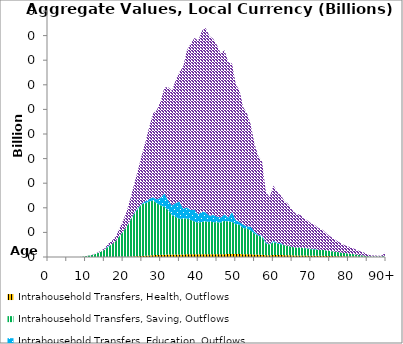
| Category | Intrahousehold Transfers, Health, Outflows | Intrahousehold Transfers, Saving, Outflows | Intrahousehold Transfers, Education, Outflows | Intrahousehold Transfers, Consumption other than health and education, Outflows |
|---|---|---|---|---|
| 0 | 0 | 0 | 0 | 0 |
|  | 0 | 0 | 0 | 0 |
| 2 | 0 | 0 | 0 | 0 |
| 3 | 0 | 0 | 0 | 0 |
| 4 | 0 | 0 | 0 | 0 |
| 5 | 0 | 0 | 0 | 0 |
| 6 | 0 | 0 | 0 | 0 |
| 7 | 0 | 0.003 | 0 | 0 |
| 8 | 0 | 0.023 | 0 | 0.002 |
| 9 | 0 | 0.139 | 0 | 0.013 |
| 10 | 0.001 | 0.575 | 0 | 0.046 |
| 11 | 0.002 | 1.24 | 0 | 0.125 |
| 12 | 0.005 | 1.8 | 0 | 0.222 |
| 13 | 0.011 | 2.937 | 0 | 0.452 |
| 14 | 0.018 | 4.168 | 0 | 0.77 |
| 15 | 0.026 | 5.753 | 0 | 1.125 |
| 16 | 0.041 | 8.189 | 0.634 | 1.755 |
| 17 | 0.058 | 10.365 | 0 | 2.621 |
| 18 | 0.08 | 12.707 | 0 | 3.69 |
| 19 | 0.12 | 16.817 | 0.11 | 6.054 |
| 20 | 0.166 | 20.52 | 0.163 | 8.84 |
| 21 | 0.236 | 24.615 | 0.067 | 12.438 |
| 22 | 0.349 | 29.89 | 0.311 | 17.809 |
| 23 | 0.487 | 34.715 | 0.671 | 24.065 |
| 24 | 0.643 | 38.749 | 0.839 | 30.945 |
| 25 | 0.853 | 42.023 | 0.51 | 39.974 |
| 26 | 1.056 | 42.728 | 1.695 | 48.631 |
| 27 | 1.29 | 43.96 | 2.113 | 58.899 |
| 28 | 1.502 | 44.371 | 2.784 | 68.13 |
| 29 | 1.609 | 42.073 | 3.172 | 72.73 |
| 30 | 1.733 | 40.245 | 6.374 | 78.414 |
| 31 | 1.894 | 38.817 | 11.05 | 86.074 |
| 32 | 1.985 | 36.187 | 7.8 | 92.05 |
| 33 | 1.935 | 32.077 | 7.948 | 93.178 |
| 34 | 1.988 | 30.54 | 11.405 | 99.812 |
| 35 | 1.992 | 29.142 | 13.99 | 105.293 |
| 36 | 2.077 | 29.148 | 8.02 | 115.632 |
| 37 | 2.183 | 29.064 | 9.217 | 127.625 |
| 38 | 2.201 | 27.939 | 8.006 | 135.308 |
| 39 | 2.176 | 26.657 | 9.838 | 139.489 |
| 40 | 2.155 | 25.789 | 6.577 | 141.378 |
| 41 | 2.22 | 26.317 | 8.51 | 146.974 |
| 42 | 2.267 | 26.712 | 7.282 | 149.929 |
| 43 | 2.23 | 26.24 | 5.135 | 146.01 |
| 44 | 2.208 | 26.142 | 5.855 | 143.122 |
| 45 | 2.193 | 26.034 | 4.684 | 139.241 |
| 46 | 2.187 | 25.822 | 4.142 | 133.239 |
| 47 | 2.324 | 27.013 | 5.369 | 133.547 |
| 48 | 2.363 | 26.492 | 3.231 | 126.243 |
| 49 | 2.414 | 26.083 | 8.127 | 120.709 |
| 50 | 2.339 | 24.36 | 3.2 | 110.449 |
| 51 | 2.397 | 23.745 | 2.377 | 106.781 |
| 52 | 2.279 | 21.195 | 2.867 | 95.348 |
| 53 | 2.329 | 20.915 | 1.623 | 91.831 |
| 54 | 2.229 | 19.25 | 3.278 | 82.74 |
| 55 | 2.026 | 16.923 | 1.518 | 71.177 |
| 56 | 1.933 | 15.441 | 0.667 | 63.962 |
| 57 | 1.909 | 14.398 | 1.04 | 60.198 |
| 58 | 1.365 | 9.729 | 1.023 | 40.921 |
| 59 | 1.342 | 8.895 | 0.125 | 38.194 |
| 60 | 1.663 | 10.362 | 1.042 | 45.004 |
| 61 | 1.615 | 9.503 | 0.389 | 41.653 |
| 62 | 1.568 | 8.803 | 0.876 | 38.879 |
| 63 | 1.495 | 8.018 | 0.026 | 35.767 |
| 64 | 1.456 | 7.629 | 0.04 | 33.873 |
| 65 | 1.328 | 6.847 | 0.047 | 30.105 |
| 66 | 1.246 | 6.401 | 0.01 | 27.427 |
| 67 | 1.259 | 6.446 | 0.169 | 26.853 |
| 68 | 1.185 | 6.05 | 0.005 | 24.319 |
| 69 | 1.148 | 5.783 | 0.272 | 22.659 |
| 70 | 1.086 | 5.309 | 0.29 | 20.785 |
| 71 | 1.053 | 5.167 | 0.426 | 19.403 |
| 72 | 0.991 | 4.939 | 0.008 | 17.606 |
| 73 | 0.955 | 4.868 | 0.024 | 16.571 |
| 74 | 0.837 | 4.481 | 0.084 | 14.083 |
| 75 | 0.76 | 4.144 | 0.041 | 12.097 |
| 76 | 0.699 | 3.857 | 0.006 | 10.503 |
| 77 | 0.631 | 3.475 | 0 | 8.897 |
| 78 | 0.566 | 3.083 | 0.014 | 7.502 |
| 79 | 0.494 | 2.689 | 0.003 | 6.348 |
| 80 | 0.443 | 2.422 | 0 | 5.63 |
| 81 | 0.374 | 2.06 | 0.023 | 4.779 |
| 82 | 0.315 | 1.753 | 0.008 | 4.088 |
| 83 | 0.233 | 1.326 | 0 | 3.119 |
| 84 | 0.186 | 1.083 | 0 | 2.571 |
| 85 | 0.098 | 0.584 | 0 | 1.398 |
| 86 | 0.06 | 0.373 | 0 | 0.898 |
| 87 | 0.052 | 0.34 | 0 | 0.822 |
| 88 | 0.038 | 0.274 | 0.001 | 0.67 |
| 89 | 0.047 | 0.371 | 0 | 0.914 |
| 90+ | 0.136 | 1.172 | 0 | 2.929 |